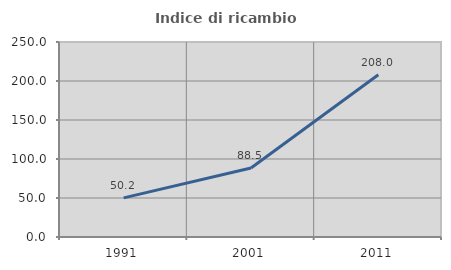
| Category | Indice di ricambio occupazionale  |
|---|---|
| 1991.0 | 50.175 |
| 2001.0 | 88.519 |
| 2011.0 | 207.979 |